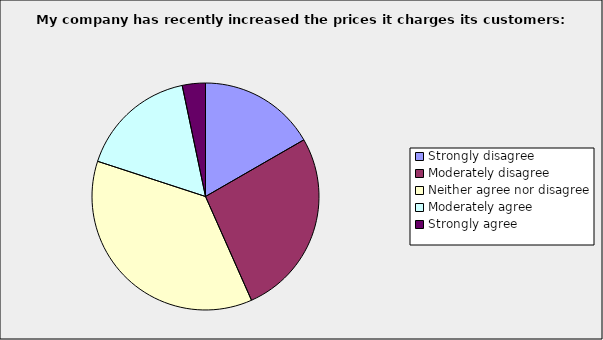
| Category | Series 0 |
|---|---|
| Strongly disagree | 0.167 |
| Moderately disagree | 0.267 |
| Neither agree nor disagree | 0.367 |
| Moderately agree | 0.167 |
| Strongly agree | 0.033 |